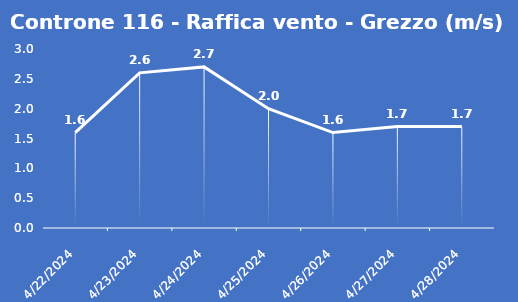
| Category | Controne 116 - Raffica vento - Grezzo (m/s) |
|---|---|
| 4/22/24 | 1.6 |
| 4/23/24 | 2.6 |
| 4/24/24 | 2.7 |
| 4/25/24 | 2 |
| 4/26/24 | 1.6 |
| 4/27/24 | 1.7 |
| 4/28/24 | 1.7 |